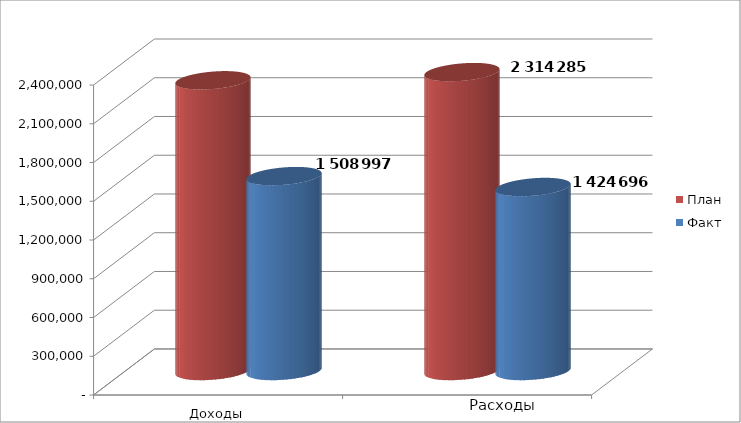
| Category | План | Факт |
|---|---|---|
| 0 | 2250910 | 1508997 |
| 1 | 2314285 | 1424695.9 |